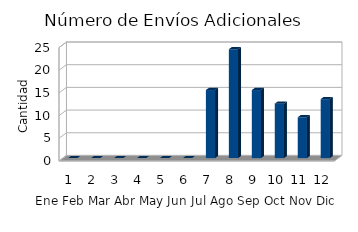
| Category | Series 0 |
|---|---|
| 0 | 0 |
| 1 | 0 |
| 2 | 0 |
| 3 | 0 |
| 4 | 0 |
| 5 | 0 |
| 6 | 15 |
| 7 | 24 |
| 8 | 15 |
| 9 | 12 |
| 10 | 9 |
| 11 | 13 |